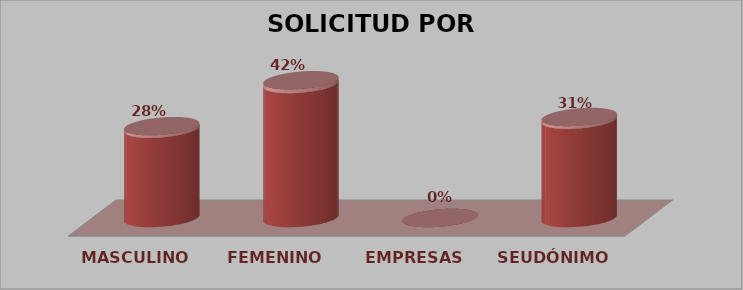
| Category | SOLICITUD POR GÉNERO | Series 1 |
|---|---|---|
| MASCULINO | 10 | 0.278 |
| FEMENINO | 15 | 0.417 |
| EMPRESAS | 0 | 0 |
| SEUDÓNIMO | 11 | 0.306 |